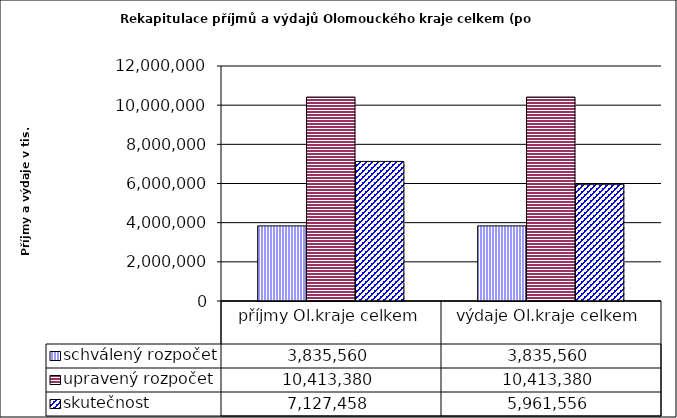
| Category | schválený rozpočet | upravený rozpočet | skutečnost |
|---|---|---|---|
| příjmy Ol.kraje celkem | 3835560 | 10413380 | 7127458 |
| výdaje Ol.kraje celkem | 3835560 | 10413380 | 5961556 |